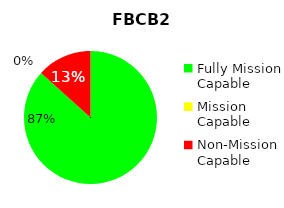
| Category | Series 0 |
|---|---|
| Fully Mission Capable | 13 |
| Mission Capable | 0 |
| Non-Mission Capable | 2 |